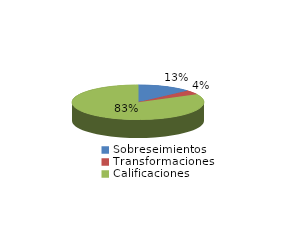
| Category | Series 0 |
|---|---|
| Sobreseimientos | 418 |
| Transformaciones | 126 |
| Calificaciones | 2595 |